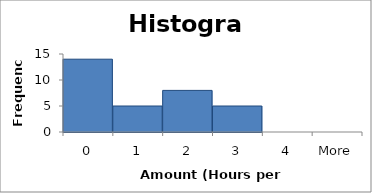
| Category | Frequency |
|---|---|
| 0 | 14 |
| 1 | 5 |
| 2 | 8 |
| 3 | 5 |
| 4 | 0 |
| More | 0 |